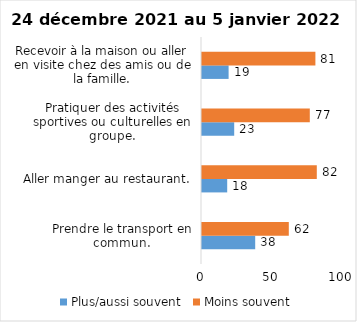
| Category | Plus/aussi souvent | Moins souvent |
|---|---|---|
| Prendre le transport en commun. | 38 | 62 |
| Aller manger au restaurant. | 18 | 82 |
| Pratiquer des activités sportives ou culturelles en groupe. | 23 | 77 |
| Recevoir à la maison ou aller en visite chez des amis ou de la famille. | 19 | 81 |